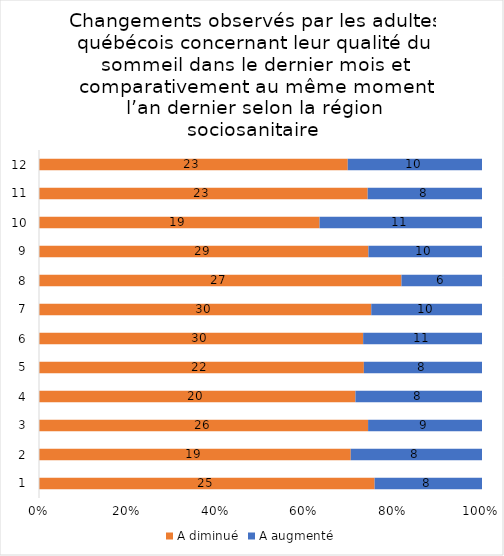
| Category | A diminué | A augmenté |
|---|---|---|
| 0 | 25 | 8 |
| 1 | 19 | 8 |
| 2 | 26 | 9 |
| 3 | 20 | 8 |
| 4 | 22 | 8 |
| 5 | 30 | 11 |
| 6 | 30 | 10 |
| 7 | 27 | 6 |
| 8 | 29 | 10 |
| 9 | 19 | 11 |
| 10 | 23 | 8 |
| 11 | 23 | 10 |